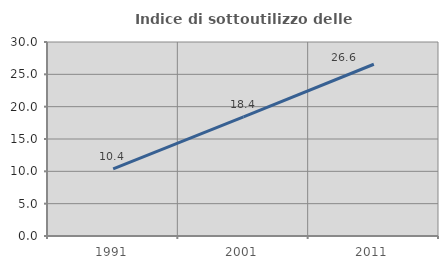
| Category | Indice di sottoutilizzo delle abitazioni  |
|---|---|
| 1991.0 | 10.369 |
| 2001.0 | 18.436 |
| 2011.0 | 26.56 |